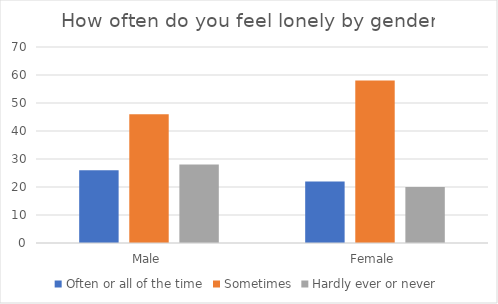
| Category | Often or all of the time | Sometimes | Hardly ever or never |
|---|---|---|---|
| Male | 26 | 46 | 28 |
| Female | 22 | 58 | 20 |